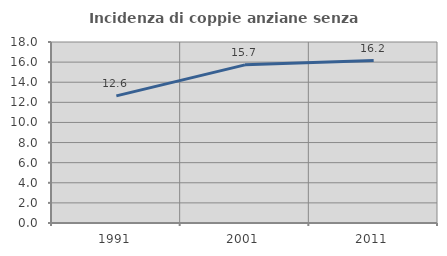
| Category | Incidenza di coppie anziane senza figli  |
|---|---|
| 1991.0 | 12.643 |
| 2001.0 | 15.728 |
| 2011.0 | 16.152 |